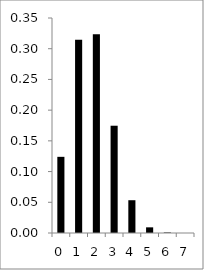
| Category | Series 0 |
|---|---|
| 0.0 | 0.124 |
| 1.0 | 0.314 |
| 2.0 | 0.323 |
| 3.0 | 0.175 |
| 4.0 | 0.053 |
| 5.0 | 0.009 |
| 6.0 | 0.001 |
| 7.0 | 0 |